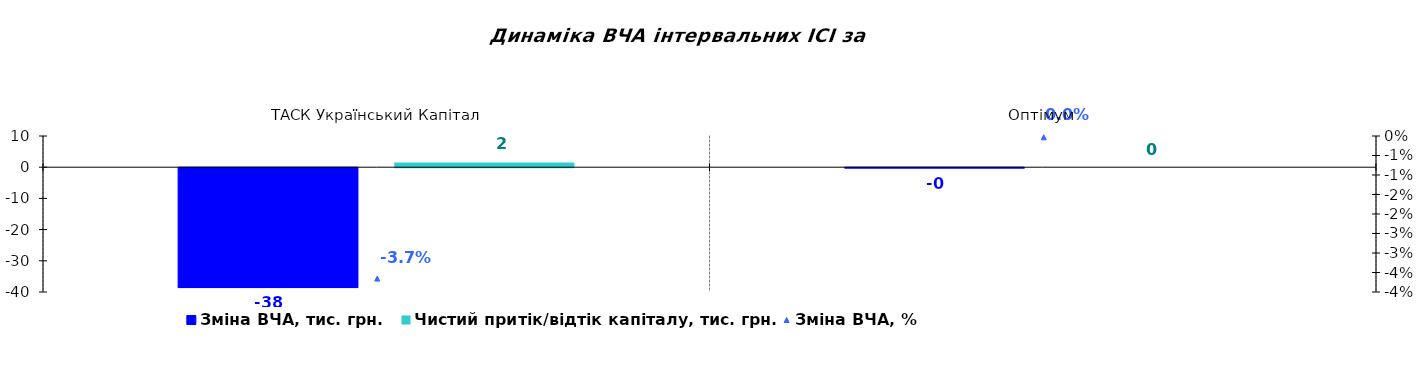
| Category | Зміна ВЧА, тис. грн. | Чистий притік/відтік капіталу, тис. грн. |
|---|---|---|
| ТАСК Український Капітал | -38.424 | 1.538 |
| Оптімум | -0.107 | 0 |